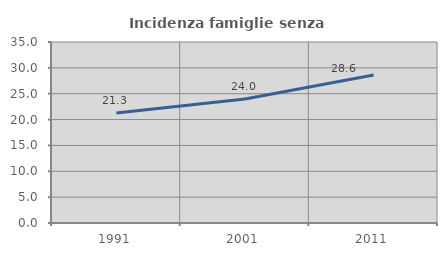
| Category | Incidenza famiglie senza nuclei |
|---|---|
| 1991.0 | 21.288 |
| 2001.0 | 23.968 |
| 2011.0 | 28.616 |